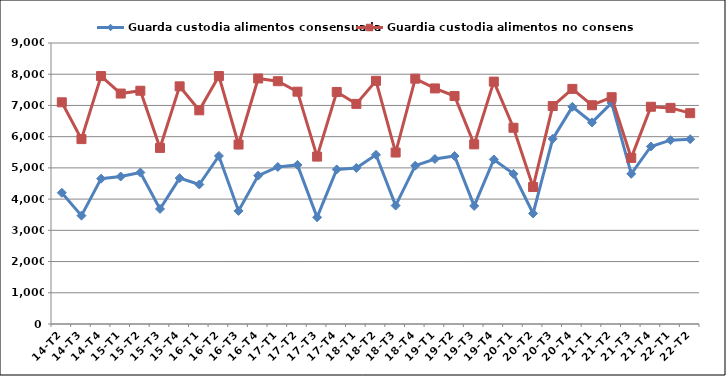
| Category | Guarda custodia alimentos consensuada | Guardia custodia alimentos no consensuada |
|---|---|---|
| 14-T2 | 4203 | 7101 |
| 14-T3 | 3471 | 5922 |
| 14-T4 | 4655 | 7941 |
| 15-T1 | 4724 | 7381 |
| 15-T2 | 4852 | 7471 |
| 15-T3 | 3684 | 5640 |
| 15-T4 | 4672 | 7612 |
| 16-T1 | 4468 | 6844 |
| 16-T2 | 5382 | 7942 |
| 16-T3 | 3622 | 5748 |
| 16-T4 | 4753 | 7864 |
| 17-T1 | 5030 | 7776 |
| 17-T2 | 5094 | 7441 |
| 17-T3 | 3417 | 5362 |
| 17-T4 | 4951 | 7432 |
| 18-T1 | 4998 | 7050 |
| 18-T2 | 5420 | 7789 |
| 18-T3 | 3793 | 5492 |
| 18-T4 | 5070 | 7857 |
| 19-T1 | 5285 | 7545 |
| 19-T2 | 5380 | 7303 |
| 19-T3 | 3782 | 5753 |
| 19-T4 | 5269 | 7763 |
| 20-T1 | 4809 | 6286 |
| 20-T2 | 3542 | 4387 |
| 20-T3 | 5930 | 6981 |
| 20-T4 | 6955 | 7530 |
| 21-T1 | 6456 | 7006 |
| 21-T2 | 7080 | 7264 |
| 21-T3 | 4810 | 5320 |
| 21-T4 | 5686 | 6958 |
| 22-T1 | 5888 | 6922 |
| 22-T2 | 5919 | 6753 |